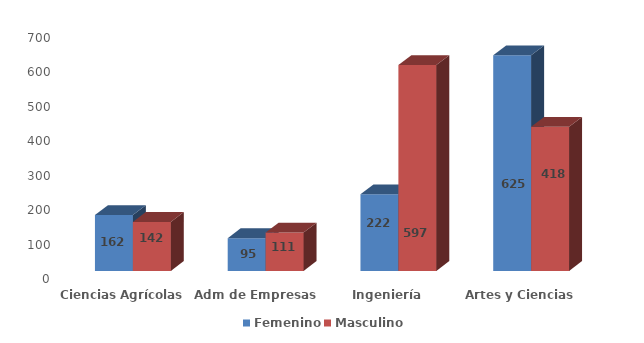
| Category | Femenino | Masculino |
|---|---|---|
| Ciencias Agrícolas | 162 | 142 |
| Adm de Empresas | 95 | 111 |
| Ingeniería | 222 | 597 |
| Artes y Ciencias | 625 | 418 |